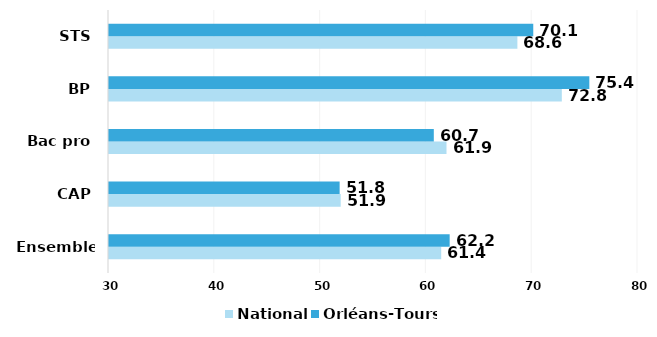
| Category | National | Orléans-Tours |
|---|---|---|
| Ensemble* | 61.4 | 62.2 |
| CAP | 51.9 | 51.8 |
| Bac pro | 61.9 | 60.7 |
| BP | 72.8 | 75.4 |
| STS | 68.6 | 70.1 |